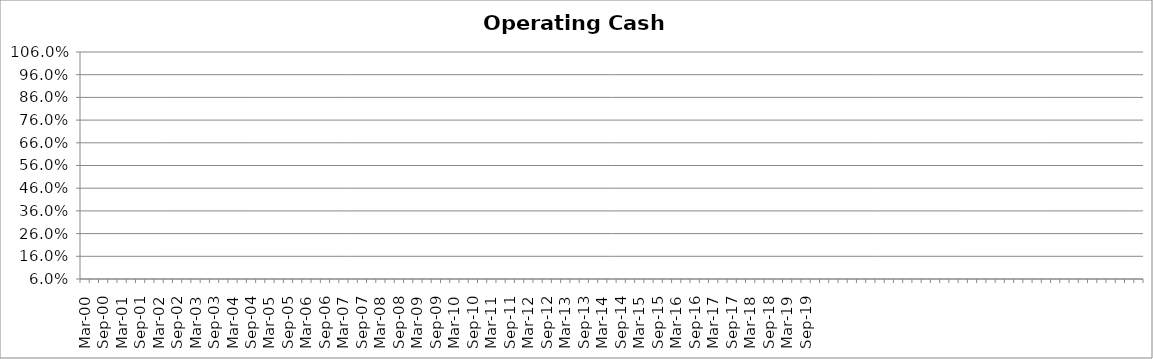
| Category | Operating Cash Margin |
|---|---|
| Mar-00 | 0.031 |
| Jun-00 | 0.033 |
| Sep-00 | 0.033 |
| Dec-00 | 0.034 |
| Mar-01 | 0.033 |
| Jun-01 | 0.036 |
| Sep-01 | 0.035 |
| Dec-01 | 0.032 |
| Mar-02 | 0.034 |
| Jun-02 | 0.035 |
| Sep-02 | 0.032 |
| Dec-02 | 0.039 |
| Mar-03 | 0.035 |
| Jun-03 | 0.038 |
| Sep-03 | 0.04 |
| Dec-03 | 0.036 |
| Mar-04 | 0.041 |
| Jun-04 | 0.043 |
| Sep-04 | 0.041 |
| Dec-04 | 0.037 |
| Mar-05 | 0.036 |
| Jun-05 | 0.034 |
| Sep-05 | 0.034 |
| Dec-05 | 0.036 |
| Mar-06 | 0.035 |
| Jun-06 | 0.029 |
| Sep-06 | 0.032 |
| Dec-06 | 0.031 |
| Mar-07 | 0.029 |
| Jun-07 | 0.03 |
| Sep-07 | 0.033 |
| Dec-07 | 0.036 |
| Mar-08 | 0.035 |
| Jun-08 | 0.036 |
| Sep-08 | 0.035 |
| Dec-08 | 0.039 |
| Mar-09 | 0.039 |
| Jun-09 | 0.042 |
| Sep-09 | 0.044 |
| Dec-09 | 0.04 |
| Mar-10 | 0.041 |
| Jun-10 | 0.036 |
| Sep-10 | 0.036 |
| Dec-10 | 0.035 |
| Mar-11 | 0.035 |
| Jun-11 | 0.035 |
| Sep-11 | 0.036 |
| Dec-11 | 0.036 |
| Mar-12 | 0.042 |
| Jun-12 | 0.034 |
| Sep-12 | 0.033 |
| Dec-12 | 0.037 |
| Mar-13 | 0.036 |
| Jun-13 | 0.037 |
| Sep-13 | 0.042 |
| Dec-13 | 0.036 |
| Mar-14 | 0.035 |
| Jun-14 | 0.034 |
| Sep-14 | 0.037 |
| Dec-14 | 0.041 |
| Mar-15 | 0.043 |
| Jun-15 | 0.043 |
| Sep-15 | 0.039 |
| Dec-15 | 0.047 |
| Mar-16 | 0.046 |
| Jun-16 | 0.038 |
| Sep-16 | 0.037 |
| Dec-16 | 0.042 |
| Mar-17 | 0.037 |
| Jun-17 | 0.041 |
| Sep-17 | 0.032 |
| Dec-17 | 0.039 |
| Mar-18 | 0.039 |
| Jun-18 | 0.039 |
| Sep-18 | 0.038 |
| Dec-18 | 0.036 |
| Mar-19 | 0.038 |
| Jun-19 | 0.038 |
| Sep-19 | 0.041 |